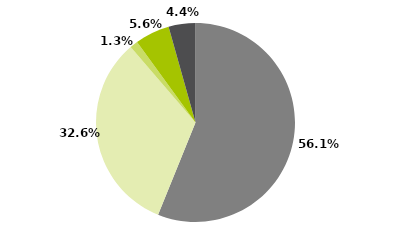
| Category | Series 0 |
|---|---|
| Multimercados Macro | 0.561 |
| Multimercados Livre | 0.326 |
| Multimercados L/S - Neutro | 0.013 |
| Multimercados L/S - Direcional | 0.056 |
| Outros | 0.044 |